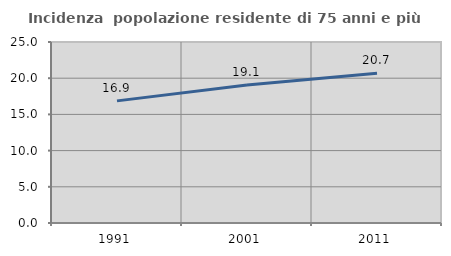
| Category | Incidenza  popolazione residente di 75 anni e più |
|---|---|
| 1991.0 | 16.869 |
| 2001.0 | 19.055 |
| 2011.0 | 20.69 |